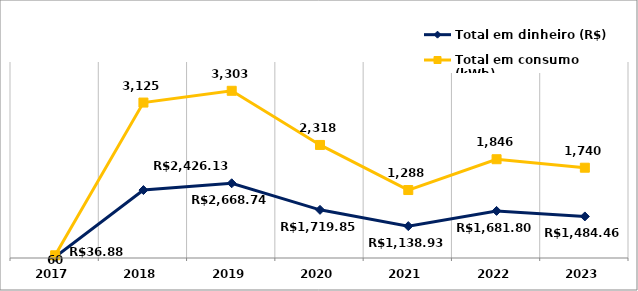
| Category | Total em dinheiro (R$) | Total em consumo (kWh) |
|---|---|---|
| 2017.0 | 36.88 | 60 |
| 2018.0 | 2426.13 | 3125 |
| 2019.0 | 2668.74 | 3303 |
| 2020.0 | 1719.85 | 2318 |
| 2021.0 | 1138.93 | 1288 |
| 2022.0 | 1681.8 | 1846 |
| 2023.0 | 1484.46 | 1740 |